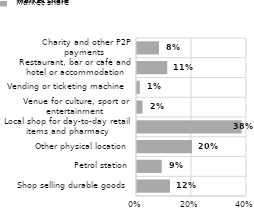
| Category | Market share |
|---|---|
| Shop selling durable goods  | 0.12 |
| Petrol station | 0.09 |
| Other physical location | 0.2 |
| Local shop for day-to-day retail items and pharmacy | 0.38 |
| Venue for culture, sport or entertainment  | 0.02 |
| Vending or ticketing machine  | 0.01 |
| Restaurant, bar or café and hotel or accommodation | 0.11 |
| Charity and other P2P payments  | 0.08 |